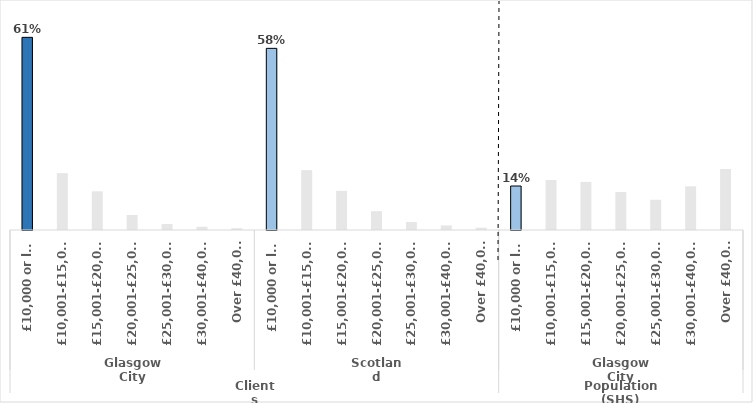
| Category | Series 0 |
|---|---|
| 0 | 0.613 |
| 1 | 0.181 |
| 2 | 0.123 |
| 3 | 0.048 |
| 4 | 0.019 |
| 5 | 0.01 |
| 6 | 0.006 |
| 7 | 0.578 |
| 8 | 0.19 |
| 9 | 0.124 |
| 10 | 0.06 |
| 11 | 0.026 |
| 12 | 0.014 |
| 13 | 0.007 |
| 14 | 0.14 |
| 15 | 0.159 |
| 16 | 0.153 |
| 17 | 0.121 |
| 18 | 0.096 |
| 19 | 0.139 |
| 20 | 0.194 |